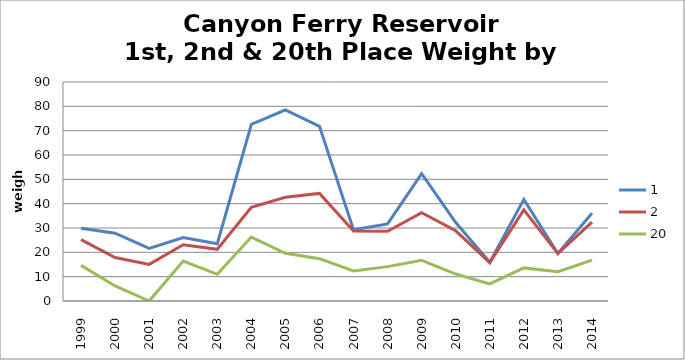
| Category | 1 | 2 | 20 |
|---|---|---|---|
| 1999.0 | 29.92 | 25.24 | 14.64 |
| 2000.0 | 27.86 | 17.86 | 6.18 |
| 2001.0 | 21.61 | 15.04 | 0 |
| 2002.0 | 26.1 | 23.1 | 16.42 |
| 2003.0 | 23.56 | 21.24 | 10.98 |
| 2004.0 | 72.62 | 38.5 | 26.28 |
| 2005.0 | 78.5 | 42.64 | 19.58 |
| 2006.0 | 71.8 | 44.2 | 17.4 |
| 2007.0 | 29.24 | 28.73 | 12.38 |
| 2008.0 | 31.68 | 28.68 | 14.12 |
| 2009.0 | 52.38 | 36.26 | 16.7 |
| 2010.0 | 32.26 | 28.85 | 11.08 |
| 2011.0 | 15.91 | 15.75 | 7.06 |
| 2012.0 | 41.76 | 37.42 | 13.6 |
| 2013.0 | 19.54 | 19.5 | 12.06 |
| 2014.0 | 36.06 | 32.44 | 16.81 |